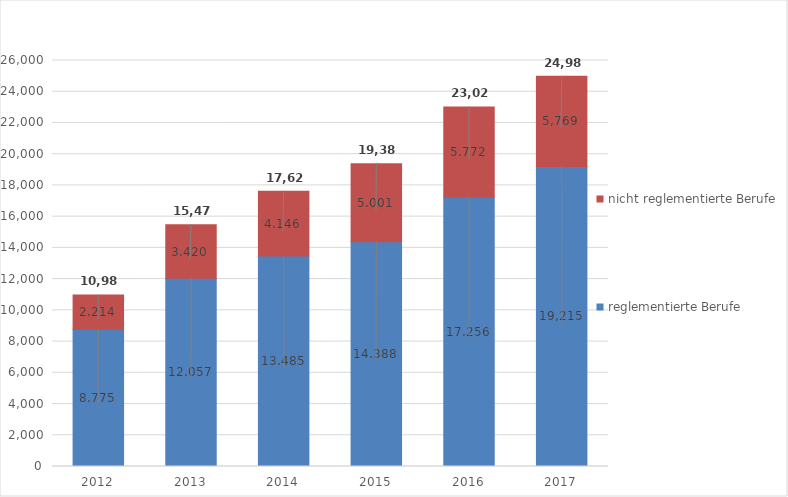
| Category | reglementierte Berufe | nicht reglementierte Berufe |
|---|---|---|
| 2012.0 | 8775 | 2214 |
| 2013.0 | 12057 | 3420 |
| 2014.0 | 13485 | 4146 |
| 2015.0 | 14388 | 5001 |
| 2016.0 | 17256 | 5772 |
| 2017.0 | 19215 | 5769 |